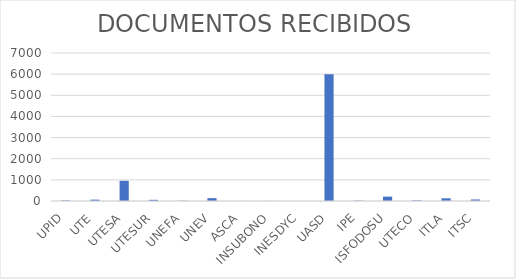
| Category | Series 0 |
|---|---|
| UPID | 26 |
| UTE | 64 |
| UTESA | 956 |
| UTESUR | 56 |
| UNEFA | 12 |
| UNEV | 135 |
| ASCA | 2 |
| INSUBONO | 3 |
| INESDYC | 1 |
| UASD | 6000 |
| IPE | 16 |
| ISFODOSU | 206 |
| UTECO | 29 |
| ITLA | 129 |
| ITSC | 72 |